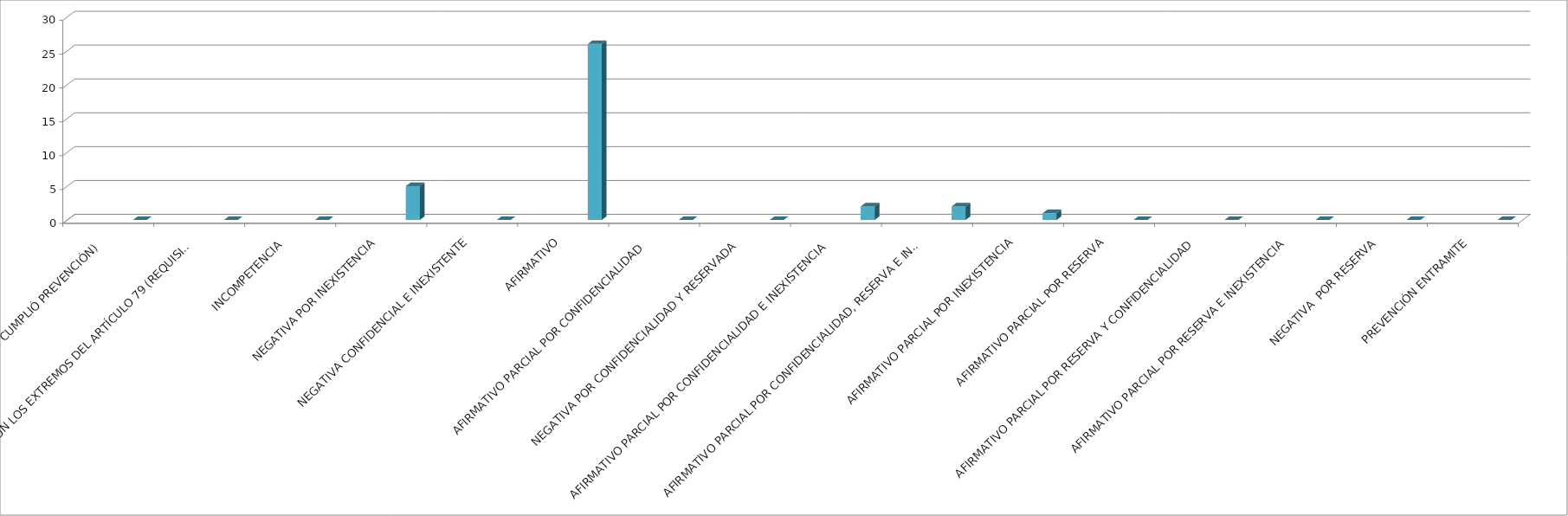
| Category | Series 0 | Series 1 | Series 2 | Series 3 | Series 4 |
|---|---|---|---|---|---|
| SE TIENE POR NO PRESENTADA ( NO CUMPLIÓ PREVENCIÓN) |  |  |  |  | 0 |
| NO CUMPLIO CON LOS EXTREMOS DEL ARTÍCULO 79 (REQUISITOS) |  |  |  |  | 0 |
| INCOMPETENCIA  |  |  |  |  | 0 |
| NEGATIVA POR INEXISTENCIA |  |  |  |  | 5 |
| NEGATIVA CONFIDENCIAL E INEXISTENTE |  |  |  |  | 0 |
| AFIRMATIVO |  |  |  |  | 26 |
| AFIRMATIVO PARCIAL POR CONFIDENCIALIDAD  |  |  |  |  | 0 |
| NEGATIVA POR CONFIDENCIALIDAD Y RESERVADA |  |  |  |  | 0 |
| AFIRMATIVO PARCIAL POR CONFIDENCIALIDAD E INEXISTENCIA |  |  |  |  | 2 |
| AFIRMATIVO PARCIAL POR CONFIDENCIALIDAD, RESERVA E INEXISTENCIA |  |  |  |  | 2 |
| AFIRMATIVO PARCIAL POR INEXISTENCIA |  |  |  |  | 1 |
| AFIRMATIVO PARCIAL POR RESERVA |  |  |  |  | 0 |
| AFIRMATIVO PARCIAL POR RESERVA Y CONFIDENCIALIDAD |  |  |  |  | 0 |
| AFIRMATIVO PARCIAL POR RESERVA E INEXISTENCIA |  |  |  |  | 0 |
| NEGATIVA  POR RESERVA |  |  |  |  | 0 |
| PREVENCIÓN ENTRAMITE |  |  |  |  | 0 |